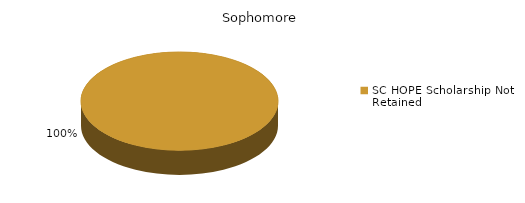
| Category | Sophomore |
|---|---|
| SC HOPE Scholarship Not Retained  | 1 |